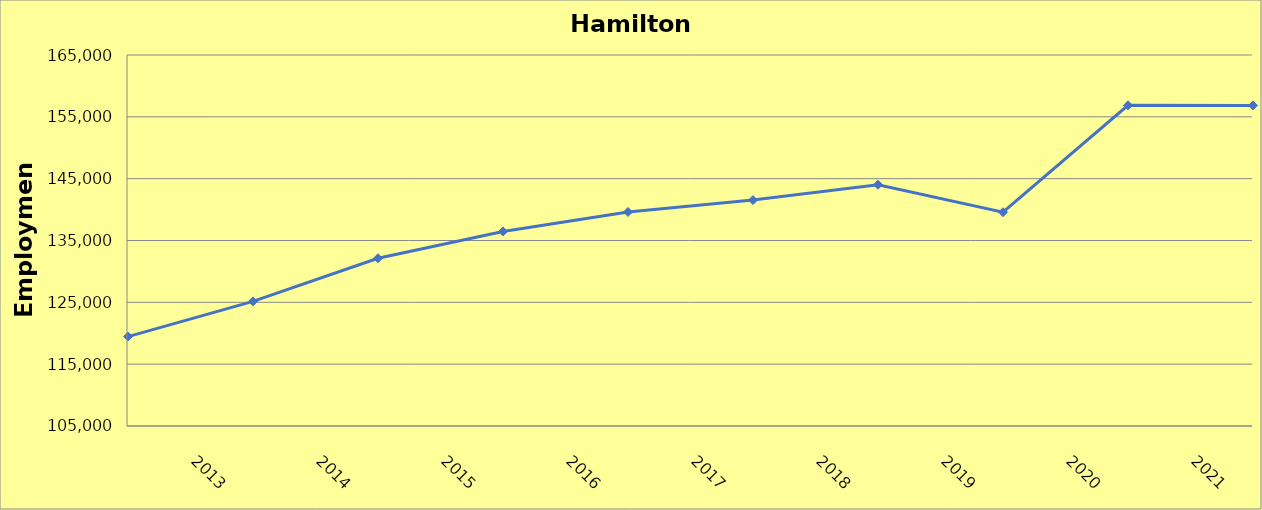
| Category | Hamilton County |
|---|---|
| 2013.0 | 119460 |
| 2014.0 | 125160 |
| 2015.0 | 132130 |
| 2016.0 | 136470 |
| 2017.0 | 139610 |
| 2018.0 | 141540 |
| 2019.0 | 144020 |
| 2020.0 | 139570 |
| 2021.0 | 156860 |
| 2022.0 | 156844 |